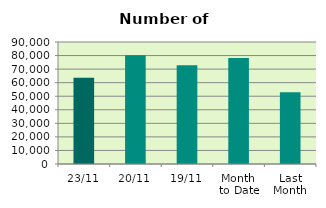
| Category | Series 0 |
|---|---|
| 23/11 | 63560 |
| 20/11 | 80270 |
| 19/11 | 72786 |
| Month 
to Date | 78224 |
| Last
Month | 52845 |